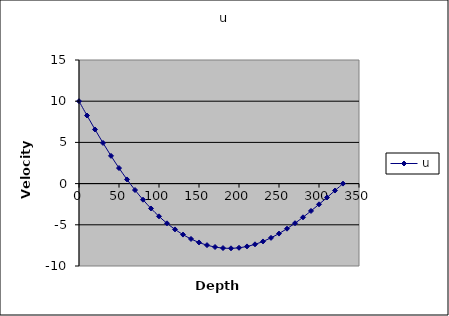
| Category | u |
|---|---|
| 0.0 | 10 |
| 10.0 | 8.264 |
| 20.0 | 6.569 |
| 30.0 | 4.931 |
| 40.0 | 3.366 |
| 50.0 | 1.887 |
| 60.0 | 0.503 |
| 70.0 | -0.778 |
| 80.0 | -1.953 |
| 90.0 | -3.018 |
| 100.0 | -3.974 |
| 110.0 | -4.82 |
| 120.0 | -5.557 |
| 130.0 | -6.189 |
| 140.0 | -6.717 |
| 150.0 | -7.143 |
| 160.0 | -7.468 |
| 170.0 | -7.695 |
| 180.0 | -7.823 |
| 190.0 | -7.853 |
| 200.0 | -7.786 |
| 210.0 | -7.624 |
| 220.0 | -7.367 |
| 230.0 | -7.02 |
| 240.0 | -6.584 |
| 250.0 | -6.066 |
| 260.0 | -5.472 |
| 270.0 | -4.81 |
| 280.0 | -4.089 |
| 290.0 | -3.321 |
| 300.0 | -2.515 |
| 310.0 | -1.685 |
| 320.0 | -0.843 |
| 330.0 | 0 |